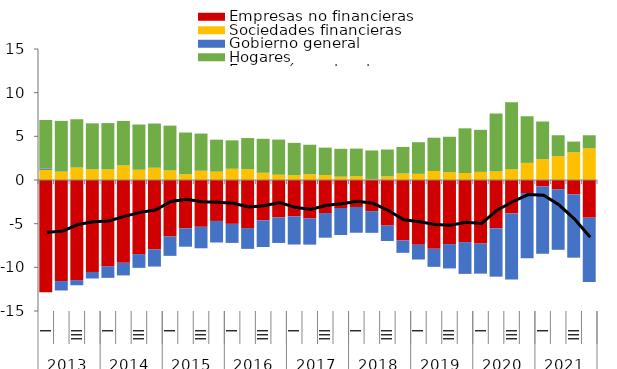
| Category | Empresas no financieras | Sociedades financieras | Gobierno general | Hogares |
|---|---|---|---|---|
| 0 | -12.854 | 1.16 | 0.125 | 5.594 |
| 1 | -11.57 | 0.961 | -1.081 | 5.809 |
| 2 | -11.466 | 1.427 | -0.586 | 5.526 |
| 3 | -10.52 | 1.228 | -0.759 | 5.261 |
| 4 | -9.895 | 1.21 | -1.31 | 5.306 |
| 5 | -9.487 | 1.668 | -1.439 | 5.093 |
| 6 | -8.488 | 1.176 | -1.572 | 5.178 |
| 7 | -7.962 | 1.404 | -1.949 | 5.062 |
| 8 | -6.474 | 1.091 | -2.211 | 5.134 |
| 9 | -5.529 | 0.659 | -2.109 | 4.775 |
| 10 | -5.359 | 1.06 | -2.459 | 4.258 |
| 11 | -4.687 | 0.957 | -2.469 | 3.661 |
| 12 | -5.022 | 1.285 | -2.183 | 3.254 |
| 13 | -5.506 | 1.246 | -2.379 | 3.557 |
| 14 | -4.617 | 0.825 | -3.053 | 3.891 |
| 15 | -4.288 | 0.604 | -2.92 | 4.025 |
| 16 | -4.159 | 0.55 | -3.226 | 3.704 |
| 17 | -4.411 | 0.652 | -2.989 | 3.384 |
| 18 | -3.787 | 0.556 | -2.818 | 3.151 |
| 19 | -3.208 | 0.381 | -3.09 | 3.189 |
| 20 | -3.088 | 0.44 | -2.95 | 3.154 |
| 21 | -3.569 | 0.121 | -2.479 | 3.262 |
| 22 | -5.22 | 0.412 | -1.764 | 3.08 |
| 23 | -6.912 | 0.746 | -1.426 | 3.037 |
| 24 | -7.421 | 0.706 | -1.684 | 3.62 |
| 25 | -7.883 | 1.03 | -2.062 | 3.811 |
| 26 | -7.344 | 0.894 | -2.78 | 4.057 |
| 27 | -7.111 | 0.793 | -3.64 | 5.124 |
| 28 | -7.281 | 0.93 | -3.442 | 4.814 |
| 29 | -5.541 | 0.981 | -5.529 | 6.633 |
| 30 | -3.829 | 1.237 | -7.578 | 7.679 |
| 31 | -1.502 | 1.958 | -7.467 | 5.34 |
| 32 | -0.742 | 2.381 | -7.708 | 4.316 |
| 33 | -1.065 | 2.735 | -6.928 | 2.388 |
| 34 | -1.651 | 3.176 | -7.243 | 1.224 |
| 35 | -4.315 | 3.619 | -7.358 | 1.504 |